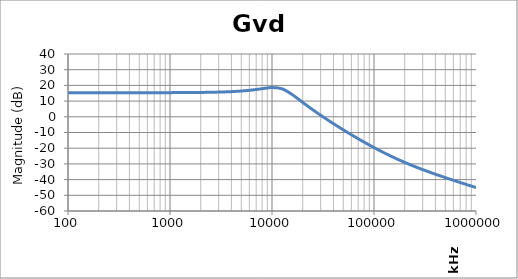
| Category | Gvd Gain |
|---|---|
| 100.0 | 15.349 |
| 125.89254117941677 | 15.349 |
| 158.48931924611153 | 15.35 |
| 199.52623149688802 | 15.35 |
| 251.18864315095806 | 15.351 |
| 316.22776601683825 | 15.353 |
| 398.1071705534976 | 15.355 |
| 501.1872336272727 | 15.359 |
| 630.9573444801932 | 15.365 |
| 794.3282347242821 | 15.375 |
| 1000.0 | 15.391 |
| 1258.925411794168 | 15.416 |
| 1584.8931924611156 | 15.455 |
| 1995.2623149688804 | 15.518 |
| 2511.886431509581 | 15.617 |
| 3162.2776601683804 | 15.775 |
| 3981.071705534977 | 16.024 |
| 5011.872336272732 | 16.415 |
| 6309.573444801938 | 17.016 |
| 7943.282347242815 | 17.864 |
| 10000.0 | 18.647 |
| 12589.254117941671 | 17.799 |
| 15848.931924611146 | 14.059 |
| 19952.623149688792 | 9.211 |
| 25118.86431509586 | 4.462 |
| 31622.77660168384 | -0.019 |
| 39810.71705534974 | -4.273 |
| 50118.723362727294 | -8.348 |
| 63095.73444801934 | -12.264 |
| 79432.82347242824 | -16.021 |
| 100000.0 | -19.597 |
| 125892.54117941685 | -22.967 |
| 158489.31924611164 | -26.108 |
| 199526.23149688813 | -29.012 |
| 251188.64315095844 | -31.693 |
| 316227.7660168382 | -34.184 |
| 398107.17055349716 | -36.524 |
| 501187.23362727347 | -38.753 |
| 630957.3444801942 | -40.904 |
| 794328.2347242833 | -43.002 |
| 1000000.0 | -45.064 |